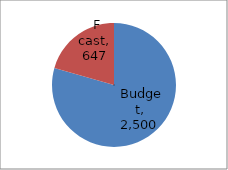
| Category | Series 0 |
|---|---|
| Budget | 2500 |
| F cast | 646.904 |